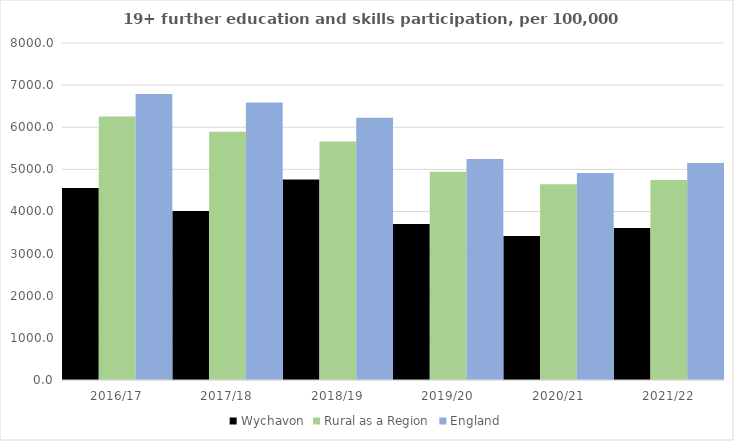
| Category | Wychavon | Rural as a Region | England |
|---|---|---|---|
| 2016/17 | 4557 | 6253.401 | 6788 |
| 2017/18 | 4010 | 5892.029 | 6588 |
| 2018/19 | 4759 | 5661.873 | 6227 |
| 2019/20 | 3702 | 4943.801 | 5244 |
| 2020/21 | 3418 | 4646.727 | 4913 |
| 2021/22 | 3607 | 4747.049 | 5151 |